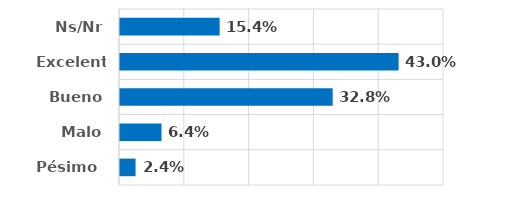
| Category | Series 0 |
|---|---|
| Pésimo  | 0.024 |
| Malo | 0.064 |
| Bueno | 0.328 |
| Excelente | 0.43 |
| Ns/Nr | 0.154 |